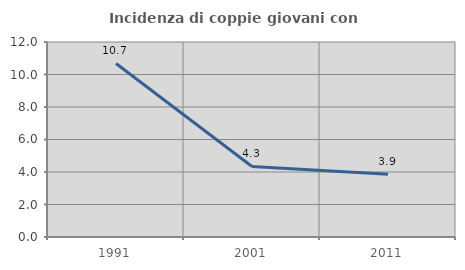
| Category | Incidenza di coppie giovani con figli |
|---|---|
| 1991.0 | 10.68 |
| 2001.0 | 4.342 |
| 2011.0 | 3.862 |